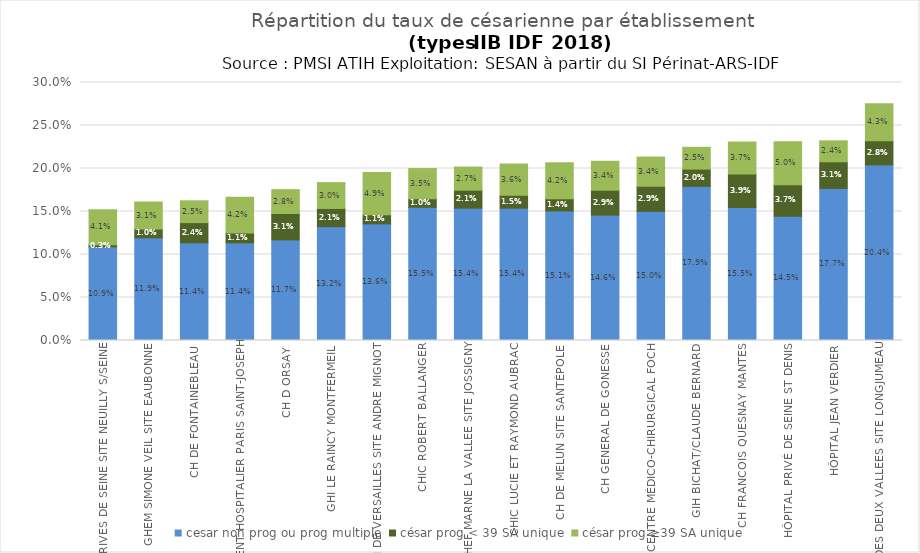
| Category | cesar non prog ou prog multiple | césar prog < 39 SA unique | césar prog ≥39 SA unique |
|---|---|---|---|
| CH RIVES DE SEINE SITE NEUILLY S/SEINE | 0.109 | 0.003 | 0.041 |
| GHEM SIMONE VEIL SITE EAUBONNE | 0.119 | 0.01 | 0.031 |
| CH DE FONTAINEBLEAU | 0.114 | 0.024 | 0.025 |
| GROUPEMENT HOSPITALIER PARIS SAINT-JOSEPH | 0.114 | 0.011 | 0.042 |
| CH D ORSAY | 0.117 | 0.031 | 0.028 |
| GHI LE RAINCY MONTFERMEIL | 0.132 | 0.021 | 0.03 |
| CH DE VERSAILLES SITE ANDRE MIGNOT | 0.136 | 0.011 | 0.049 |
| CHIC ROBERT BALLANGER | 0.155 | 0.01 | 0.035 |
| GHEF MARNE LA VALLEE SITE JOSSIGNY | 0.154 | 0.021 | 0.027 |
| CHIC LUCIE ET RAYMOND AUBRAC | 0.154 | 0.015 | 0.036 |
| CH DE MELUN SITE SANTÉPOLE | 0.151 | 0.014 | 0.042 |
| CH GENERAL DE GONESSE | 0.146 | 0.029 | 0.034 |
| CENTRE MÉDICO-CHIRURGICAL FOCH | 0.15 | 0.029 | 0.034 |
| GIH BICHAT/CLAUDE BERNARD | 0.179 | 0.02 | 0.025 |
| CH FRANCOIS QUESNAY MANTES | 0.155 | 0.039 | 0.037 |
| HÔPITAL PRIVÉ DE SEINE ST DENIS | 0.145 | 0.037 | 0.05 |
| HÔPITAL JEAN VERDIER | 0.177 | 0.031 | 0.024 |
| CH DES DEUX VALLEES SITE LONGJUMEAU | 0.204 | 0.028 | 0.043 |